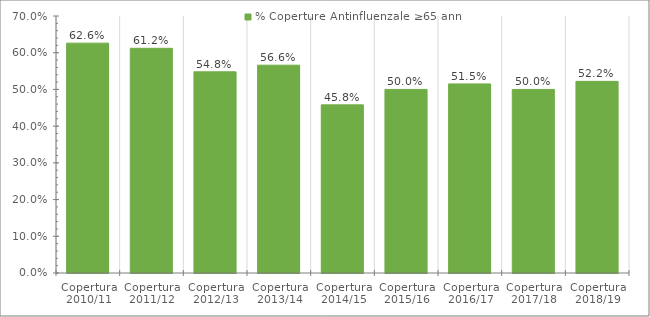
| Category | % Coperture Antinfluenzale ≥65 anni |
|---|---|
| Copertura 2010/11 | 0.626 |
| Copertura 2011/12 | 0.612 |
| Copertura 2012/13 | 0.548 |
| Copertura 2013/14 | 0.566 |
| Copertura 2014/15 | 0.458 |
| Copertura 2015/16 | 0.5 |
| Copertura 2016/17 | 0.515 |
| Copertura 2017/18 | 0.5 |
| Copertura 2018/19 | 0.522 |